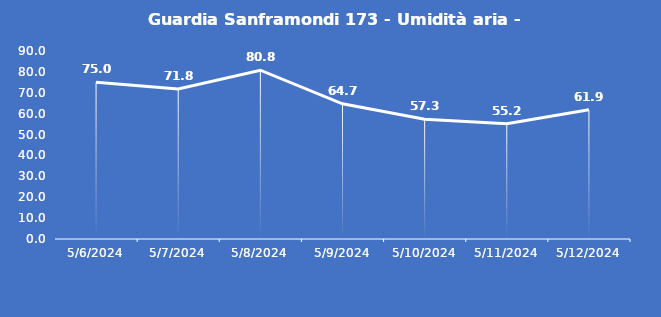
| Category | Guardia Sanframondi 173 - Umidità aria - Grezzo (%) |
|---|---|
| 5/6/24 | 75 |
| 5/7/24 | 71.8 |
| 5/8/24 | 80.8 |
| 5/9/24 | 64.7 |
| 5/10/24 | 57.3 |
| 5/11/24 | 55.2 |
| 5/12/24 | 61.9 |